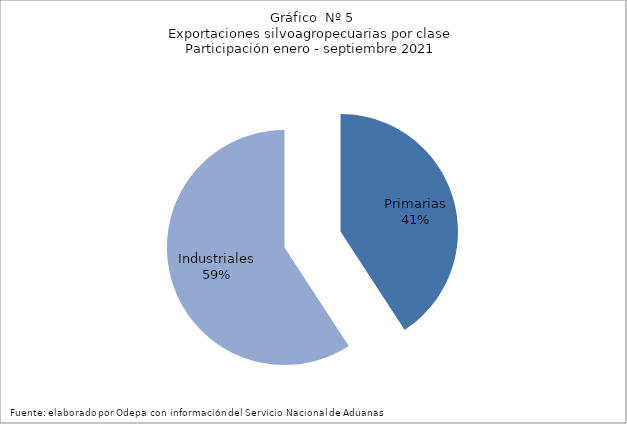
| Category | Series 0 |
|---|---|
| Primarias | 5374230 |
| Industriales | 7799155 |